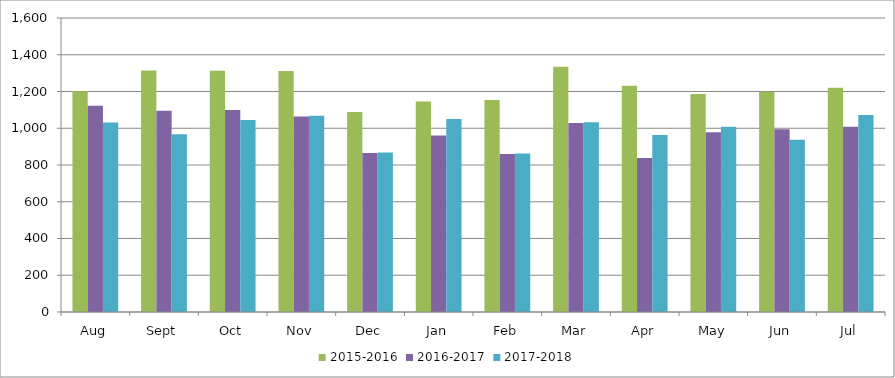
| Category | 2015-2016 | 2016-2017 | 2017-2018 |
|---|---|---|---|
| Aug | 1201 | 1123 | 1031 |
| Sept | 1314 | 1095 | 967 |
| Oct | 1313 | 1100 | 1045 |
| Nov | 1311 | 1064 | 1068 |
| Dec | 1089 | 865 | 868 |
| Jan | 1145 | 960 | 1050 |
| Feb | 1154 | 860 | 863 |
| Mar | 1335 | 1029 | 1032 |
| Apr | 1231 | 838 | 963 |
| May | 1186 | 978 | 1008 |
| Jun | 1199 | 994 | 938 |
| Jul | 1221 | 1008 | 1072 |